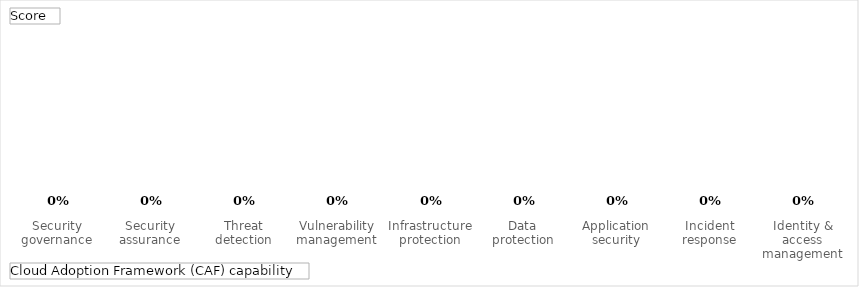
| Category | Total |
|---|---|
| Security governance | 0 |
| Security assurance | 0 |
| Threat detection | 0 |
| Vulnerability management | 0 |
| Infrastructure protection | 0 |
| Data protection | 0 |
| Application security | 0 |
| Incident response | 0 |
| Identity & access management | 0 |